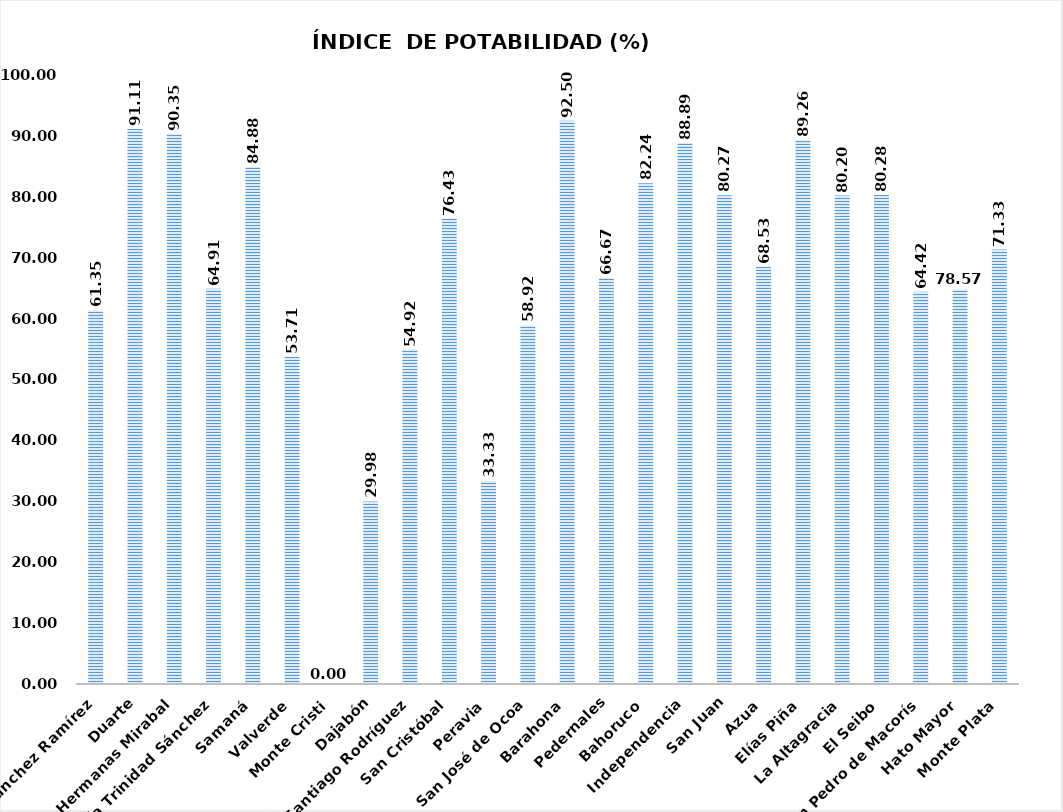
| Category | 61.35 |
|---|---|
| Sánchez Ramírez | 61.349 |
| Duarte | 91.115 |
| Hermanas Mirabal | 90.351 |
| María Trinidad Sánchez | 64.91 |
| Samaná | 84.881 |
| Valverde | 53.709 |
| Monte Cristi | 0 |
| Dajabón | 29.978 |
| Santiago Rodríguez | 54.916 |
| San Cristóbal | 76.432 |
| Peravia | 33.333 |
| San José de Ocoa | 58.92 |
| Barahona | 92.495 |
| Pedernales | 66.667 |
| Bahoruco | 82.237 |
| Independencia | 88.889 |
| San Juan | 80.269 |
| Azua | 68.533 |
| Elías Piña | 89.265 |
| La Altagracia | 80.202 |
| El Seibo | 80.278 |
| San Pedro de Macorís | 64.422 |
| Hato Mayor | 64.815 |
| Monte Plata | 71.335 |